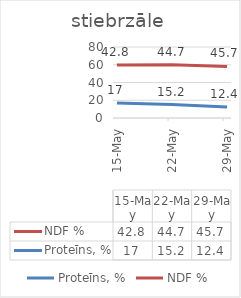
| Category | Proteīns, % | NDF % |
|---|---|---|
| 2022-05-15 | 17 | 42.8 |
| 2022-05-22 | 15.2 | 44.7 |
| 2022-05-29 | 12.4 | 45.7 |